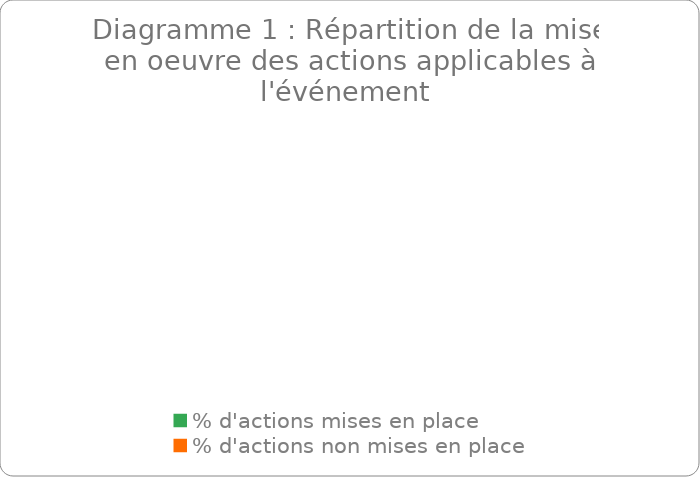
| Category | Series 0 |
|---|---|
| % d'actions mises en place | 0 |
| % d'actions non mises en place | 0 |